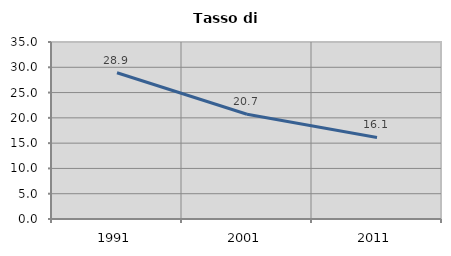
| Category | Tasso di disoccupazione   |
|---|---|
| 1991.0 | 28.919 |
| 2001.0 | 20.706 |
| 2011.0 | 16.116 |